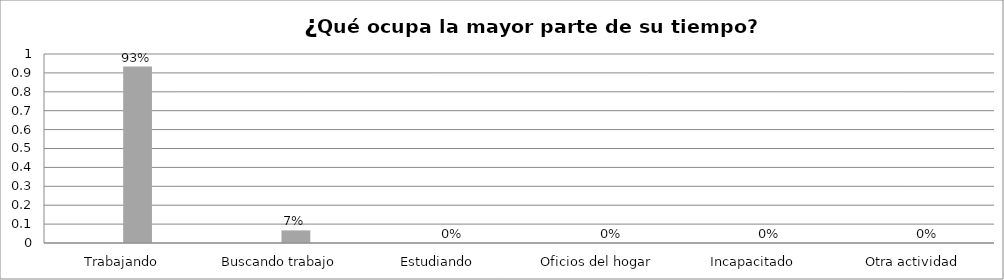
| Category | Series 0 | Series 1 | Series 2 | Series 3 |
|---|---|---|---|---|
| Trabajando |  |  | 0.933 |  |
| Buscando trabajo |  |  | 0.067 |  |
| Estudiando |  |  | 0 |  |
| Oficios del hogar |  |  | 0 |  |
| Incapacitado  |  |  | 0 |  |
| Otra actividad |  |  | 0 |  |